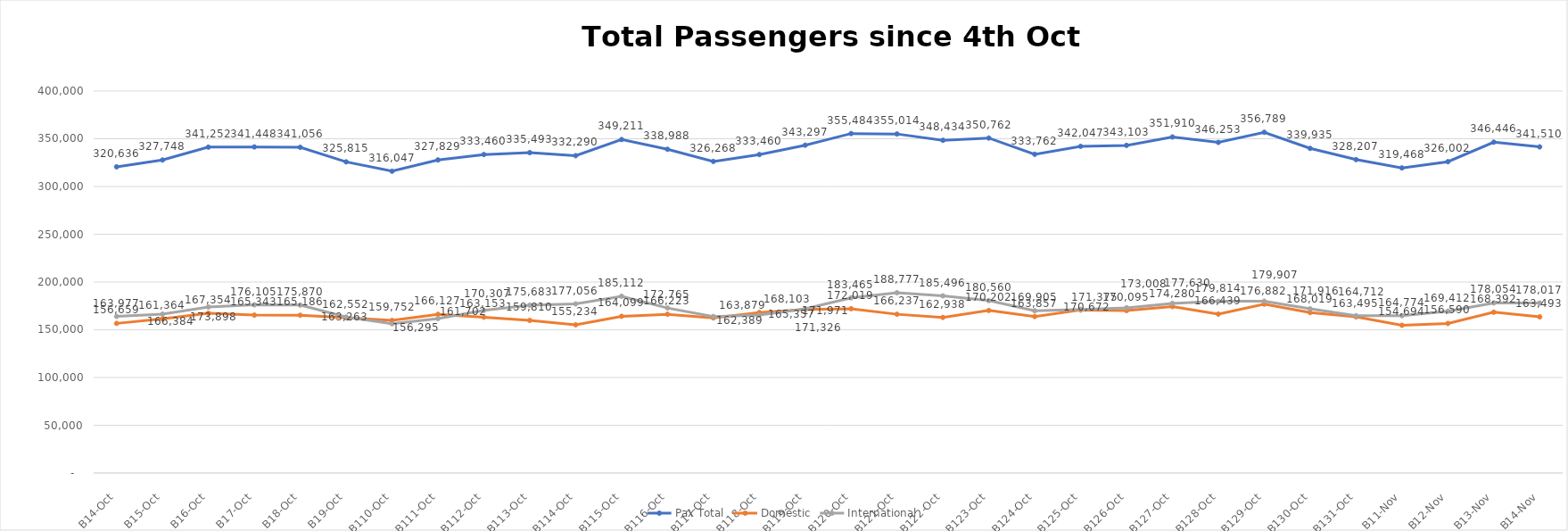
| Category | Pax Total | Domestic | International |
|---|---|---|---|
| 2023-10-04 | 320636 | 156659 | 163977 |
| 2023-10-05 | 327748 | 161364 | 166384 |
| 2023-10-06 | 341252 | 167354 | 173898 |
| 2023-10-07 | 341448 | 165343 | 176105 |
| 2023-10-08 | 341056 | 165186 | 175870 |
| 2023-10-09 | 325815 | 162552 | 163263 |
| 2023-10-10 | 316047 | 159752 | 156295 |
| 2023-10-11 | 327829 | 166127 | 161702 |
| 2023-10-12 | 333460 | 163153 | 170307 |
| 2023-10-13 | 335493 | 159810 | 175683 |
| 2023-10-14 | 332290 | 155234 | 177056 |
| 2023-10-15 | 349211 | 164099 | 185112 |
| 2023-10-16 | 338988 | 166223 | 172765 |
| 2023-10-17 | 326268 | 162389 | 163879 |
| 2023-10-18 | 333460 | 168103 | 165357 |
| 2023-10-19 | 343297 | 171326 | 171971 |
| 2023-10-20 | 355484 | 172019 | 183465 |
| 2023-10-21 | 355014 | 166237 | 188777 |
| 2023-10-22 | 348434 | 162938 | 185496 |
| 2023-10-23 | 350762 | 170202 | 180560 |
| 2023-10-24 | 333762 | 163857 | 169905 |
| 2023-10-25 | 342047 | 170672 | 171375 |
| 2023-10-26 | 343103 | 170095 | 173008 |
| 2023-10-27 | 351910 | 174280 | 177630 |
| 2023-10-28 | 346253 | 166439 | 179814 |
| 2023-10-29 | 356789 | 176882 | 179907 |
| 2023-10-30 | 339935 | 168019 | 171916 |
| 2023-10-31 | 328207 | 163495 | 164712 |
| 2023-11-01 | 319468 | 154694 | 164774 |
| 2023-11-02 | 326002 | 156590 | 169412 |
| 2023-11-03 | 346446 | 168392 | 178054 |
| 2023-11-04 | 341510 | 163493 | 178017 |